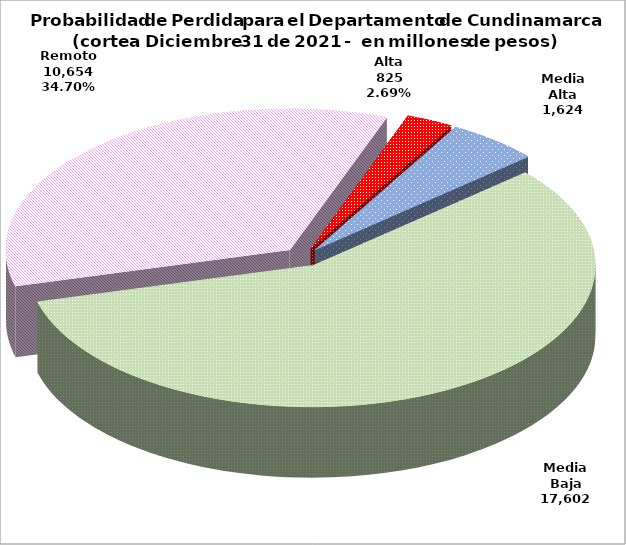
| Category | Series 0 |
|---|---|
| Alta | 824.635 |
| Media Alta | 1623.649 |
| Media Baja | 17602.281 |
| Remoto | 10654.458 |